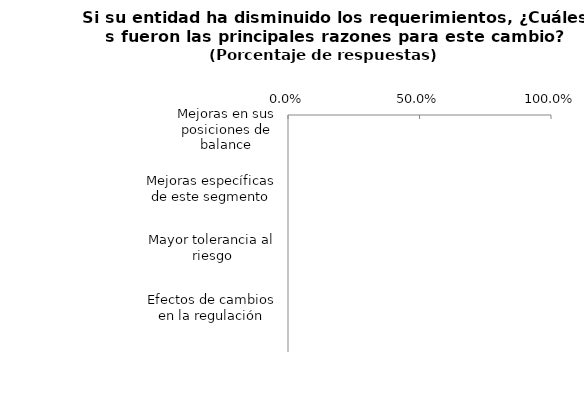
| Category | Series 0 |
|---|---|
| Mejoras en sus posiciones de balance | 0 |
| Una perspectiva económica más favorable o menos incierta | 0 |
| Mejoras específicas de este segmento | 0 |
| Mayor competencia de otras entidades | 0 |
| Mayor tolerancia al riesgo | 0 |
|  Menor preocupación por liquidez | 0 |
| Efectos de cambios en la regulación | 0 |
| Otra (especifique) | 0 |